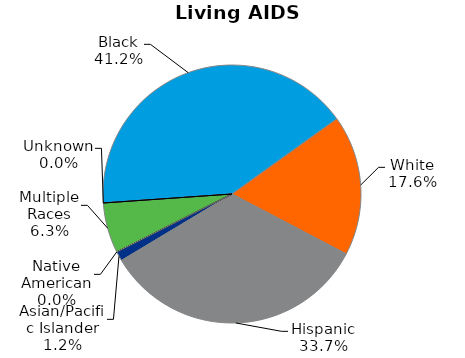
| Category | Living AIDS Cases |
|---|---|
| Black | 41.2 |
| White | 17.6 |
| Hispanic | 33.7 |
| Asian/Pacific Islander | 1.2 |
| Native American | 0 |
| Multiple Races | 6.3 |
| Unknown | 0 |